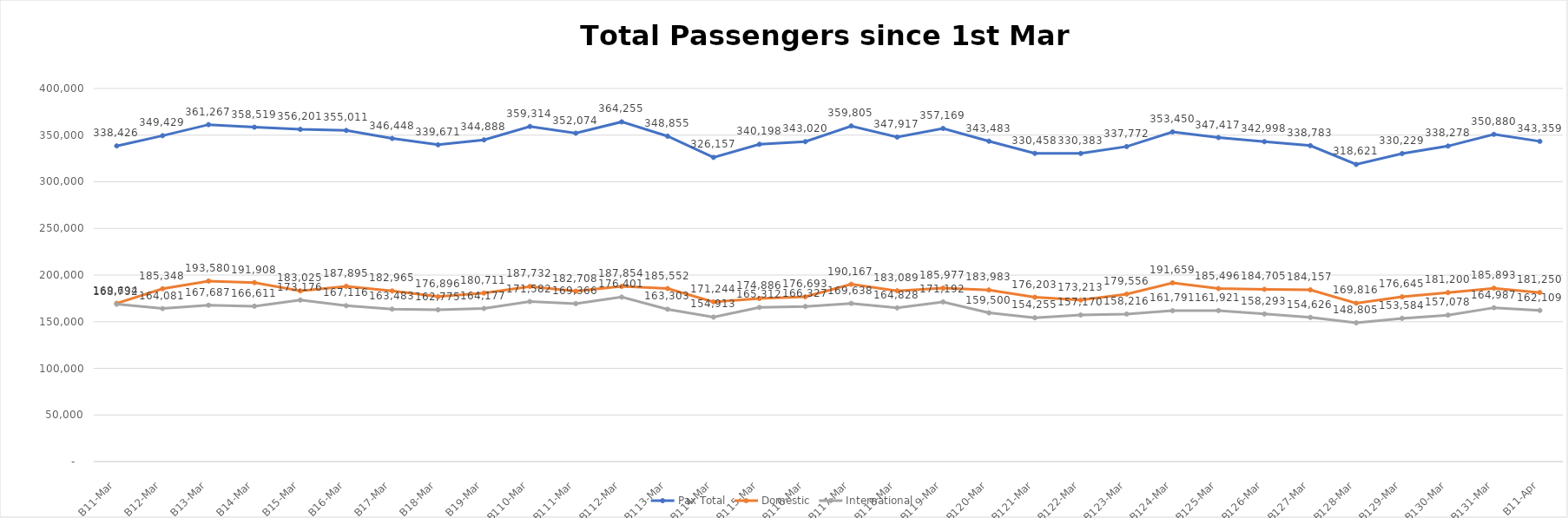
| Category | Pax Total |  Domestic  |  International  |
|---|---|---|---|
| 2023-03-01 | 338426 | 169694 | 168732 |
| 2023-03-02 | 349429 | 185348 | 164081 |
| 2023-03-03 | 361267 | 193580 | 167687 |
| 2023-03-04 | 358519 | 191908 | 166611 |
| 2023-03-05 | 356201 | 183025 | 173176 |
| 2023-03-06 | 355011 | 187895 | 167116 |
| 2023-03-07 | 346448 | 182965 | 163483 |
| 2023-03-08 | 339671 | 176896 | 162775 |
| 2023-03-09 | 344888 | 180711 | 164177 |
| 2023-03-10 | 359314 | 187732 | 171582 |
| 2023-03-11 | 352074 | 182708 | 169366 |
| 2023-03-12 | 364255 | 187854 | 176401 |
| 2023-03-13 | 348855 | 185552 | 163303 |
| 2023-03-14 | 326157 | 171244 | 154913 |
| 2023-03-15 | 340198 | 174886 | 165312 |
| 2023-03-16 | 343020 | 176693 | 166327 |
| 2023-03-17 | 359805 | 190167 | 169638 |
| 2023-03-18 | 347917 | 183089 | 164828 |
| 2023-03-19 | 357169 | 185977 | 171192 |
| 2023-03-20 | 343483 | 183983 | 159500 |
| 2023-03-21 | 330458 | 176203 | 154255 |
| 2023-03-22 | 330383 | 173213 | 157170 |
| 2023-03-23 | 337772 | 179556 | 158216 |
| 2023-03-24 | 353450 | 191659 | 161791 |
| 2023-03-25 | 347417 | 185496 | 161921 |
| 2023-03-26 | 342998 | 184705 | 158293 |
| 2023-03-27 | 338783 | 184157 | 154626 |
| 2023-03-28 | 318621 | 169816 | 148805 |
| 2023-03-29 | 330229 | 176645 | 153584 |
| 2023-03-30 | 338278 | 181200 | 157078 |
| 2023-03-31 | 350880 | 185893 | 164987 |
| 2023-04-01 | 343359 | 181250 | 162109 |